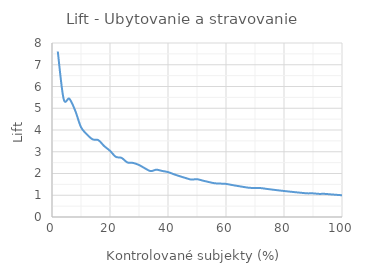
| Category | Ubytovanie a stravovanie |
|---|---|
| 2.0 | 7.609 |
| 4.0 | 5.435 |
| 6.0 | 5.435 |
| 8.0 | 4.891 |
| 10.0 | 4.13 |
| 12.0 | 3.804 |
| 14.0 | 3.571 |
| 16.0 | 3.533 |
| 18.0 | 3.261 |
| 20.0 | 3.043 |
| 22.0 | 2.767 |
| 24.0 | 2.717 |
| 26.0 | 2.508 |
| 28.0 | 2.484 |
| 30.0 | 2.391 |
| 32.0 | 2.242 |
| 34.0 | 2.11 |
| 36.0 | 2.174 |
| 38.0 | 2.117 |
| 40.0 | 2.065 |
| 42.0 | 1.967 |
| 44.0 | 1.877 |
| 46.0 | 1.796 |
| 48.0 | 1.721 |
| 50.0 | 1.739 |
| 52.0 | 1.672 |
| 54.0 | 1.61 |
| 56.0 | 1.553 |
| 58.0 | 1.537 |
| 60.0 | 1.522 |
| 62.0 | 1.473 |
| 64.0 | 1.427 |
| 66.0 | 1.383 |
| 68.0 | 1.343 |
| 70.0 | 1.335 |
| 72.0 | 1.329 |
| 74.0 | 1.293 |
| 76.0 | 1.259 |
| 78.0 | 1.226 |
| 80.0 | 1.196 |
| 82.0 | 1.166 |
| 84.0 | 1.139 |
| 86.0 | 1.112 |
| 88.0 | 1.087 |
| 90.0 | 1.087 |
| 92.0 | 1.063 |
| 94.0 | 1.064 |
| 96.0 | 1.042 |
| 98.0 | 1.02 |
| 100.0 | 1 |